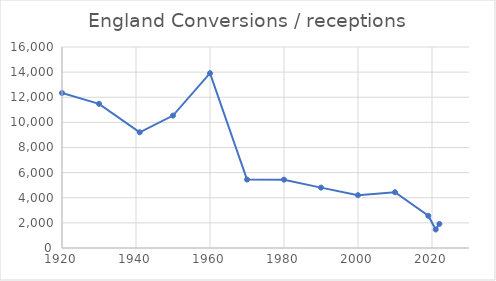
| Category | England |
|---|---|
| 1920.0 | 12339.52 |
| 1930.0 | 11477.51 |
| 1941.0 | 9208.99 |
| 1950.0 | 10542.64 |
| 1960.0 | 13914.19 |
| 1970.0 | 5448.97 |
| 1980.0 | 5439.93 |
| 1990.0 | 4804.85 |
| 2000.0 | 4206.11 |
| 2010.0 | 4443 |
| 2019.0 | 2563 |
| 2021.0 | 1470 |
| 2022.0 | 1917 |